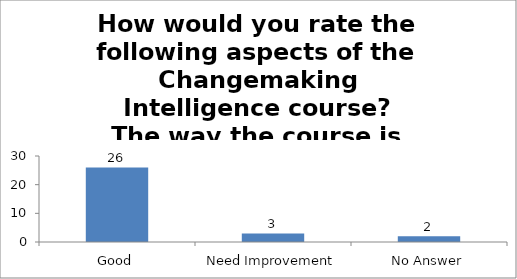
| Category | How would you rate the following aspects of the Changemaking Intelligence course?
The way the course is carried out. |
|---|---|
| Good | 26 |
| Need Improvement | 3 |
| No Answer | 2 |